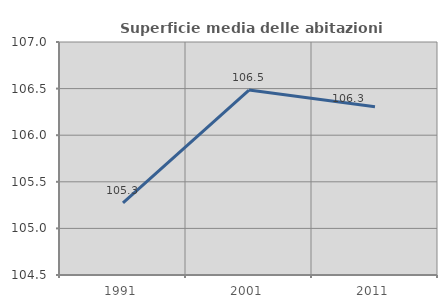
| Category | Superficie media delle abitazioni occupate |
|---|---|
| 1991.0 | 105.275 |
| 2001.0 | 106.484 |
| 2011.0 | 106.305 |